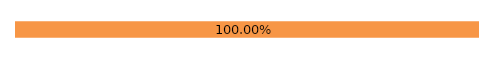
| Category | oui | non |
|---|---|---|
| 0 | 0 | 1 |